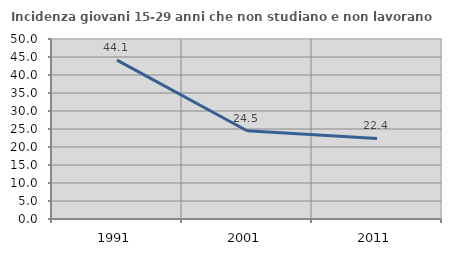
| Category | Incidenza giovani 15-29 anni che non studiano e non lavorano  |
|---|---|
| 1991.0 | 44.144 |
| 2001.0 | 24.528 |
| 2011.0 | 22.368 |